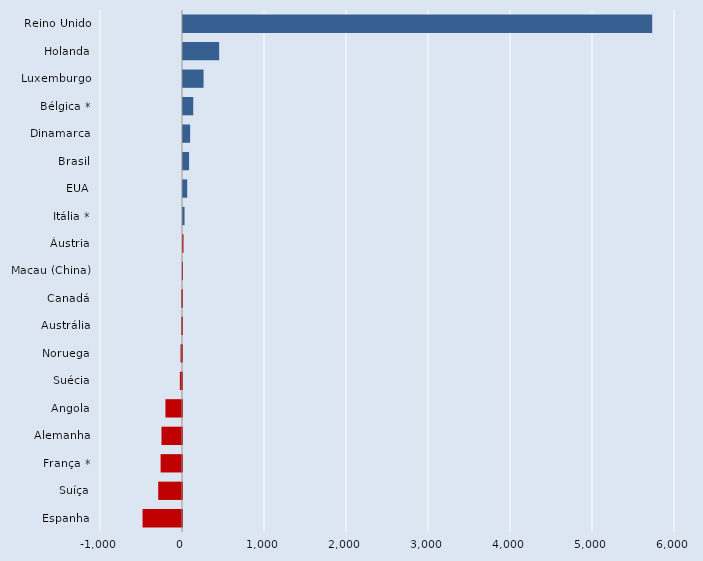
| Category | Series 0 |
|---|---|
| Espanha | -481 |
| Suíça | -290 |
| França * | -261 |
| Alemanha | -250 |
| Angola | -202 |
| Suécia | -26 |
| Noruega | -18 |
| Austrália | -10 |
| Canadá | -10 |
| Macau (China) | -2 |
| Áustria | 6 |
| Itália * | 19 |
| EUA | 51 |
| Brasil | 74 |
| Dinamarca | 87 |
| Bélgica * | 125 |
| Luxemburgo | 251 |
| Holanda | 441 |
| Reino Unido | 5722 |